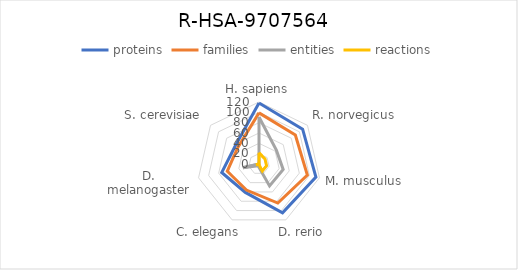
| Category | proteins | families | entities | reactions |
|---|---|---|---|---|
| H. sapiens | 118 | 99 | 91 | 22 |
| R. norvegicus | 108 | 90 | 43 | 15 |
| M. musculus | 113 | 96 | 48 | 15 |
| D. rerio | 105 | 84 | 47 | 15 |
| C. elegans | 61 | 56 | 4 | 1 |
| D. melanogaster | 74 | 63 | 32 | 6 |
| S. cerevisiae | 58 | 52 | 0 | 0 |